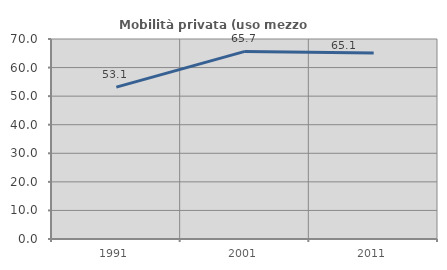
| Category | Mobilità privata (uso mezzo privato) |
|---|---|
| 1991.0 | 53.148 |
| 2001.0 | 65.657 |
| 2011.0 | 65.109 |